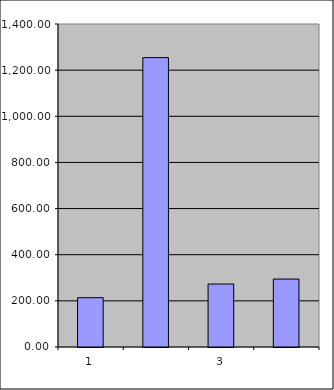
| Category | Series 0 |
|---|---|
| 0 | 213.75 |
| 1 | 1254.136 |
| 2 | 272.946 |
| 3 | 294.411 |